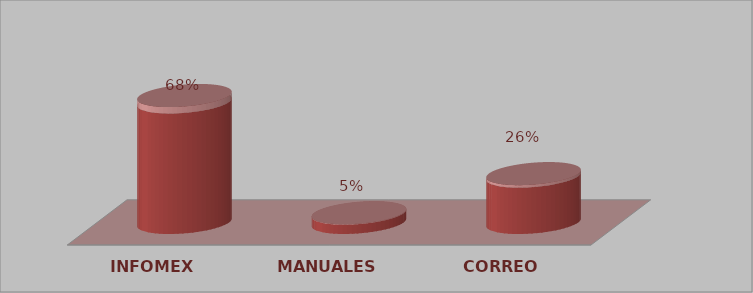
| Category | Series 0 | Series 1 |
|---|---|---|
| INFOMEX | 13 | 0.684 |
| MANUALES | 1 | 0.053 |
| CORREO | 5 | 0.263 |